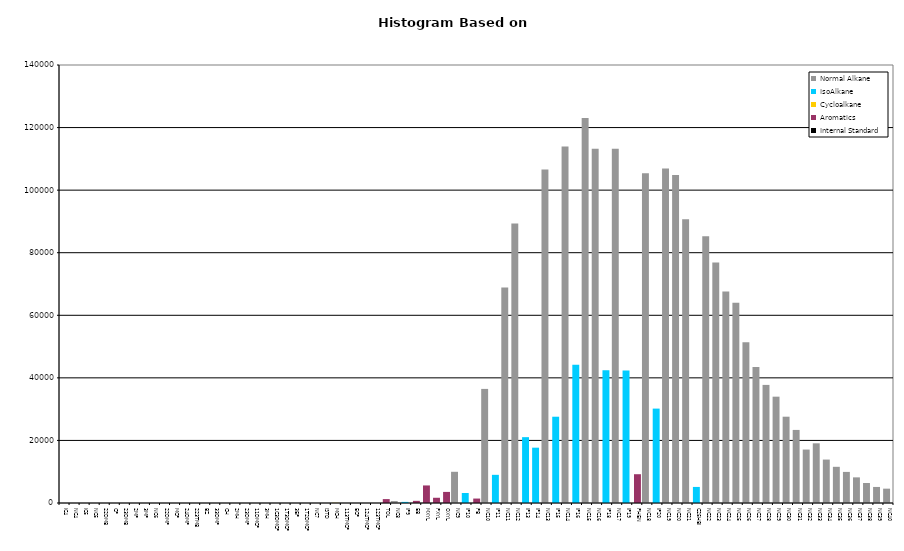
| Category | Normal Alkane | IsoAlkane | Cycloalkane | Aromatics | Internal Standard |
|---|---|---|---|---|---|
| IC4 | 0 | 0 | 0 | 0 | 0 |
| NC4 | 0 | 0 | 0 | 0 | 0 |
| IC5 | 0 | 0 | 0 | 0 | 0 |
| NC5 | 0 | 0 | 0 | 0 | 0 |
| 22DMB | 0 | 0 | 0 | 0 | 0 |
| CP | 0 | 0 | 0 | 0 | 0 |
| 23DMB | 0 | 0 | 0 | 0 | 0 |
| 2MP | 0 | 0 | 0 | 0 | 0 |
| 3MP | 0 | 0 | 0 | 0 | 0 |
| NC6 | 0 | 0 | 0 | 0 | 0 |
| 22DMP | 0 | 0 | 0 | 0 | 0 |
| MCP | 0 | 0 | 0 | 0 | 0 |
| 24DMP | 0 | 0 | 0 | 0 | 0 |
| 223TMB | 0 | 0 | 0 | 0 | 0 |
| BZ | 0 | 0 | 0 | 0 | 0 |
| 33DMP | 0 | 0 | 0 | 0 | 0 |
| CH | 0 | 0 | 0 | 0 | 0 |
| 2MH | 0 | 0 | 0 | 0 | 0 |
| 23DMP | 0 | 0 | 0 | 0 | 0 |
| 11DMCP | 0 | 0 | 0 | 0 | 0 |
| 3MH | 0 | 0 | 0 | 0 | 0 |
| 1C3DMCP | 0 | 0 | 0 | 0 | 0 |
| 1T3DMCP | 0 | 0 | 0 | 0 | 0 |
| 3EP | 0 | 0 | 0 | 0 | 0 |
| 1T2DMCP | 0 | 0 | 0 | 0 | 0 |
| NC7 | 0 | 0 | 0 | 0 | 0 |
| ISTD | 0 | 0 | 0 | 0 | 0 |
| MCH | 0 | 0 | 55 | 0 | 0 |
| 113TMCP | 0 | 0 | 0 | 0 | 0 |
| ECP | 0 | 0 | 0 | 0 | 0 |
| 124TMCP | 0 | 0 | 0 | 0 | 0 |
| 123TMCP | 0 | 0 | 0 | 0 | 0 |
| TOL | 0 | 0 | 0 | 1248 | 0 |
| NC8 | 628 | 0 | 0 | 0 | 0 |
| IP9 | 0 | 358 | 0 | 0 | 0 |
| EB | 0 | 0 | 0 | 687 | 0 |
| MXYL | 0 | 0 | 0 | 5611 | 0 |
| PXYL | 0 | 0 | 0 | 1674 | 0 |
| OXYL | 0 | 0 | 0 | 3544 | 0 |
| NC9 | 9974 | 0 | 0 | 0 | 0 |
| IP10 | 0 | 3200 | 0 | 0 | 0 |
| PB | 0 | 0 | 0 | 1422 | 0 |
| NC10 | 36469 | 0 | 0 | 0 | 0 |
| IP11 | 0 | 9004 | 0 | 0 | 0 |
| NC11 | 68914 | 0 | 0 | 0 | 0 |
| NC12 | 89377 | 0 | 0 | 0 | 0 |
| IP13 | 0 | 21047 | 0 | 0 | 0 |
| IP14 | 0 | 17683 | 0 | 0 | 0 |
| NC13 | 106636 | 0 | 0 | 0 | 0 |
| IP15 | 0 | 27578 | 0 | 0 | 0 |
| NC14 | 113975 | 0 | 0 | 0 | 0 |
| IP16 | 0 | 44155 | 0 | 0 | 0 |
| NC15 | 123067 | 0 | 0 | 0 | 0 |
| NC16 | 113209 | 0 | 0 | 0 | 0 |
| IP18 | 0 | 42395 | 0 | 0 | 0 |
| NC17 | 113254 | 0 | 0 | 0 | 0 |
| IP19 | 0 | 42339 | 0 | 0 | 0 |
| PHEN | 0 | 0 | 0 | 9204 | 0 |
| NC18 | 105407 | 0 | 0 | 0 | 0 |
| IP20 | 0 | 30173 | 0 | 0 | 0 |
| NC19 | 106940 | 0 | 0 | 0 | 0 |
| NC20 | 104807 | 0 | 0 | 0 | 0 |
| NC21 | 90726 | 0 | 0 | 0 | 0 |
| C25HBI | 0 | 5135 | 0 | 0 | 0 |
| NC22 | 85271 | 0 | 0 | 0 | 0 |
| NC23 | 76894 | 0 | 0 | 0 | 0 |
| NC24 | 67583 | 0 | 0 | 0 | 0 |
| NC25 | 63987 | 0 | 0 | 0 | 0 |
| NC26 | 51345 | 0 | 0 | 0 | 0 |
| NC27 | 43445 | 0 | 0 | 0 | 0 |
| NC28 | 37745 | 0 | 0 | 0 | 0 |
| NC29 | 33989 | 0 | 0 | 0 | 0 |
| NC30 | 27584 | 0 | 0 | 0 | 0 |
| NC31 | 23357 | 0 | 0 | 0 | 0 |
| NC32 | 17079 | 0 | 0 | 0 | 0 |
| NC33 | 19079 | 0 | 0 | 0 | 0 |
| NC34 | 13881 | 0 | 0 | 0 | 0 |
| NC35 | 11568 | 0 | 0 | 0 | 0 |
| NC36 | 9939 | 0 | 0 | 0 | 0 |
| NC37 | 8193 | 0 | 0 | 0 | 0 |
| NC38 | 6388 | 0 | 0 | 0 | 0 |
| NC39 | 5128 | 0 | 0 | 0 | 0 |
| NC40 | 4584 | 0 | 0 | 0 | 0 |